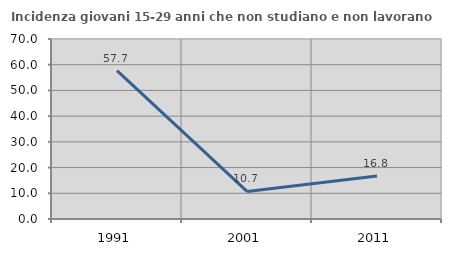
| Category | Incidenza giovani 15-29 anni che non studiano e non lavorano  |
|---|---|
| 1991.0 | 57.732 |
| 2001.0 | 10.714 |
| 2011.0 | 16.763 |